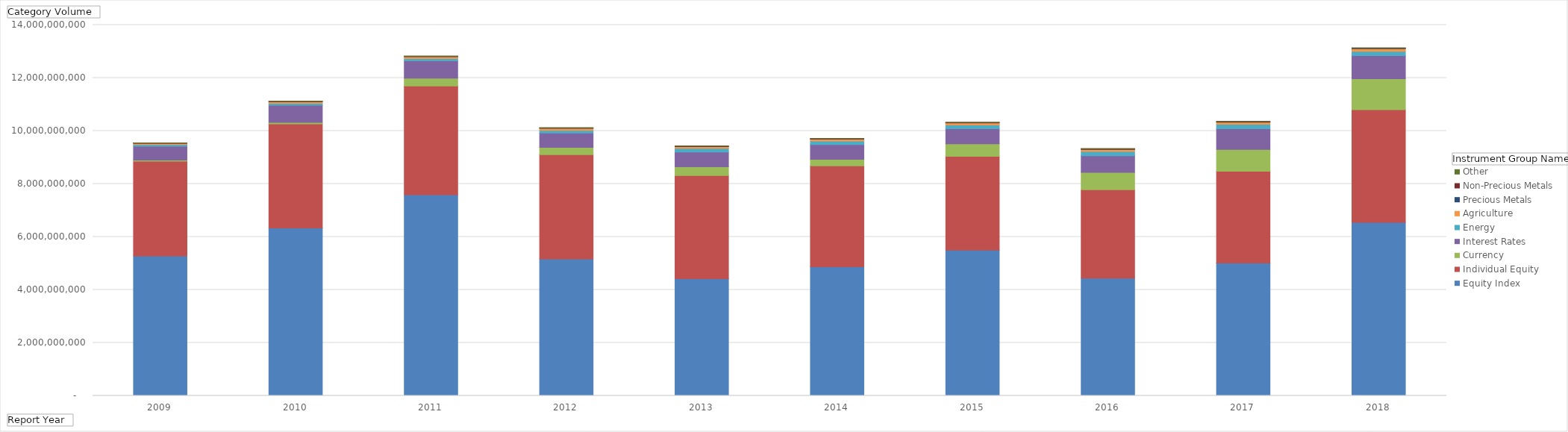
| Category | Equity Index | Individual Equity | Currency | Interest Rates | Energy | Agriculture | Precious Metals | Non-Precious Metals | Other |
|---|---|---|---|---|---|---|---|---|---|
| 2009 | 5282789655 | 3574308120 | 41186473 | 524203940 | 65485542 | 45364978 | 12121364 | 5485557 | 320023 |
| 2010 | 6338181354 | 3930234512 | 55825379 | 646246860 | 72756778 | 59406948 | 9985595 | 7837347 | 327111 |
| 2011 | 7589306927 | 4109875936 | 297089948 | 654874071 | 78736474 | 72359334 | 13448220 | 8126101 | 376167 |
| 2012 | 5172149551 | 3935443871 | 273395909 | 544401832 | 97770197 | 75464769 | 12195340 | 6556620 | 288954 |
| 2013 | 4423282489 | 3896212963 | 330586694 | 556979760 | 136868833 | 66424802 | 13437213 | 6822197 | 211686 |
| 2014 | 4872887276 | 3809692633 | 246294077 | 559971690 | 128705079 | 74802493 | 11009243 | 8712190 | 227331 |
| 2015 | 5501873442 | 3541217896 | 470958686 | 567345290 | 141498683 | 81196304 | 9218589 | 9316571 | 262625 |
| 2016 | 4446635170 | 3331569849 | 655334896 | 632498534 | 156679849 | 82651790 | 11803841 | 10447189 | 299569 |
| 2017 | 5011919689 | 3469889685 | 820858990 | 784380973 | 165795559 | 80299218 | 11948154 | 10767297 | 275165 |
| 2018 | 6551862251 | 4250978137 | 1165692029 | 874487880 | 161757141 | 100891147 | 14494153 | 10711827 | 303332 |